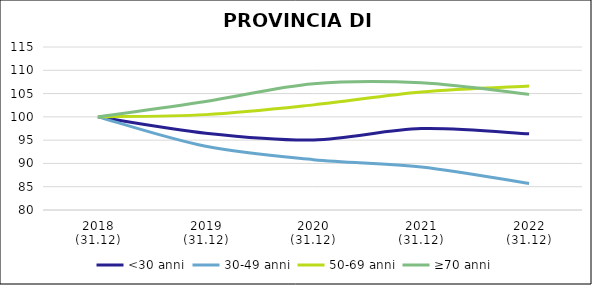
| Category | <30 anni | 30-49 anni | 50-69 anni | ≥70 anni |
|---|---|---|---|---|
| 2018
(31.12) | 100 | 100 | 100 | 100 |
| 2019
(31.12) | 96.492 | 93.676 | 100.48 | 103.303 |
| 2020
(31.12) | 95.049 | 90.813 | 102.574 | 107.11 |
| 2021
(31.12) | 97.475 | 89.25 | 105.335 | 107.318 |
| 2022
(31.12) | 96.361 | 85.705 | 106.627 | 104.826 |